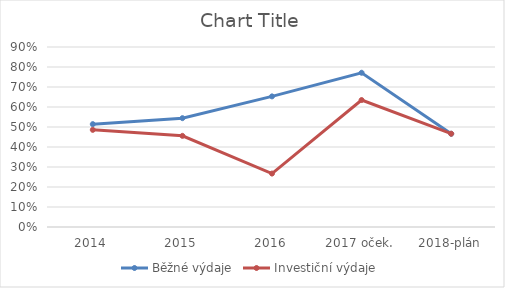
| Category | Běžné výdaje | Investiční výdaje  |
|---|---|---|
| 2014 | 0.514 | 0.486 |
| 2015 | 0.544 | 0.456 |
| 2016 | 0.653 | 0.267 |
| 2017 oček. | 0.771 | 0.635 |
| 2018-plán | 0.466 | 0.466 |